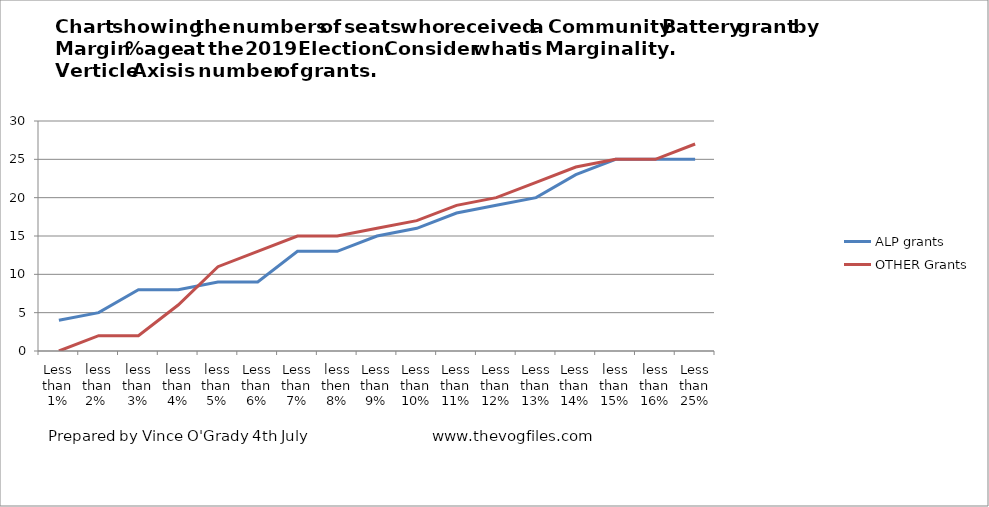
| Category | ALP grants | OTHER Grants |
|---|---|---|
| Less than 1% | 4 | 0 |
| less than 2%  | 5 | 2 |
| less than 3% | 8 | 2 |
| less than 4% | 8 | 6 |
| less than 5% | 9 | 11 |
| Less than 6% | 9 | 13 |
| Less than 7% | 13 | 15 |
| less then 8% | 13 | 15 |
| Less than 9% | 15 | 16 |
| Less than 10% | 16 | 17 |
| Less than 11% | 18 | 19 |
| Less than 12% | 19 | 20 |
| Less than 13% | 20 | 22 |
| Less than 14% | 23 | 24 |
| less than 15% | 25 | 25 |
| less than 16% | 25 | 25 |
| Less than 25% | 25 | 27 |